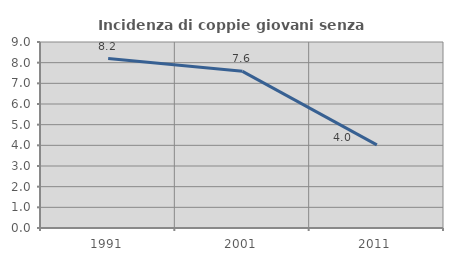
| Category | Incidenza di coppie giovani senza figli |
|---|---|
| 1991.0 | 8.199 |
| 2001.0 | 7.581 |
| 2011.0 | 4.024 |